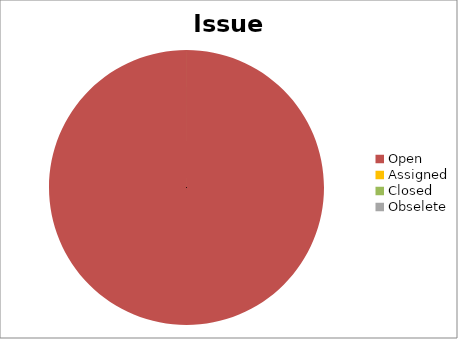
| Category | Issue Status |
|---|---|
| Open | 24 |
| Assigned | 0 |
| Closed | 0 |
| Obselete | 0 |